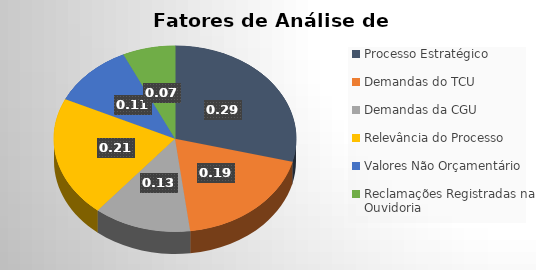
| Category | Series 0 |
|---|---|
| Processo Estratégico | 0.29 |
| Demandas do TCU | 0.19 |
| Demandas da CGU | 0.13 |
| Relevância do Processo | 0.21 |
| Valores Não Orçamentário | 0.11 |
| Reclamações Registradas na Ouvidoria | 0.07 |